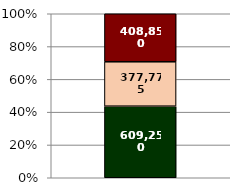
| Category | Series 2 | Series 1 | Series 0 |
|---|---|---|---|
| 0 | 609250 | 377775 | 408850 |